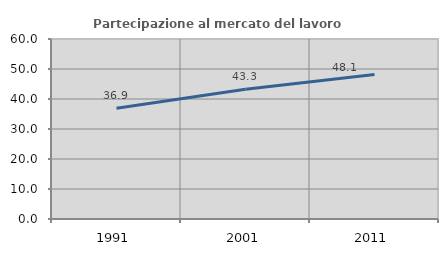
| Category | Partecipazione al mercato del lavoro  femminile |
|---|---|
| 1991.0 | 36.932 |
| 2001.0 | 43.275 |
| 2011.0 | 48.148 |